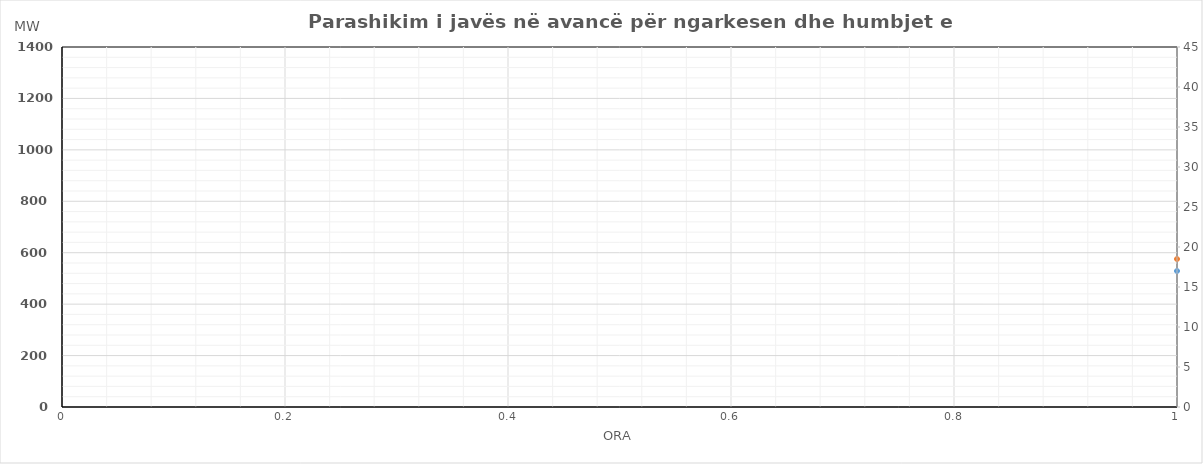
| Category | Ngarkesa (MWh) |
|---|---|
| 0 | 575.49 |
| 1 | 514.28 |
| 2 | 489.96 |
| 3 | 501.05 |
| 4 | 510.86 |
| 5 | 537.47 |
| 6 | 725.06 |
| 7 | 910.97 |
| 8 | 968.1 |
| 9 | 945.86 |
| 10 | 905.07 |
| 11 | 815.96 |
| 12 | 793.82 |
| 13 | 798.13 |
| 14 | 799.44 |
| 15 | 781.47 |
| 16 | 782.1 |
| 17 | 890.79 |
| 18 | 1000.01 |
| 19 | 1187.23 |
| 20 | 1229.87 |
| 21 | 1147.37 |
| 22 | 910.8 |
| 23 | 785.62 |
| 24 | 641.33 |
| 25 | 519.63 |
| 26 | 485.42 |
| 27 | 506.08 |
| 28 | 581.92 |
| 29 | 595.91 |
| 30 | 715.11 |
| 31 | 897.44 |
| 32 | 954.7 |
| 33 | 927.01 |
| 34 | 825.48 |
| 35 | 804.83 |
| 36 | 752.1 |
| 37 | 771.41 |
| 38 | 795.86 |
| 39 | 800.37 |
| 40 | 762.36 |
| 41 | 786.5 |
| 42 | 902.39 |
| 43 | 1001.83 |
| 44 | 1025.08 |
| 45 | 966.7 |
| 46 | 787.59 |
| 47 | 659.82 |
| 48 | 669.32 |
| 49 | 581.34 |
| 50 | 538.36 |
| 51 | 548.74 |
| 52 | 563.36 |
| 53 | 586.68 |
| 54 | 705.22 |
| 55 | 926.44 |
| 56 | 986.55 |
| 57 | 960.91 |
| 58 | 910.22 |
| 59 | 888.85 |
| 60 | 867.94 |
| 61 | 866.33 |
| 62 | 861.95 |
| 63 | 850.65 |
| 64 | 857.26 |
| 65 | 905.07 |
| 66 | 960.34 |
| 67 | 1067.69 |
| 68 | 1121.42 |
| 69 | 1062.9 |
| 70 | 931.52 |
| 71 | 756.63 |
| 72 | 608.39 |
| 73 | 547.09 |
| 74 | 534.79 |
| 75 | 537.47 |
| 76 | 546.78 |
| 77 | 567.87 |
| 78 | 698.35 |
| 79 | 890.58 |
| 80 | 945.14 |
| 81 | 920.43 |
| 82 | 867.71 |
| 83 | 842.98 |
| 84 | 822.08 |
| 85 | 830.26 |
| 86 | 839.15 |
| 87 | 822.43 |
| 88 | 821.12 |
| 89 | 881.5 |
| 90 | 938.84 |
| 91 | 1019.07 |
| 92 | 1064.2 |
| 93 | 993.29 |
| 94 | 864.59 |
| 95 | 727.89 |
| 96 | 588.61 |
| 97 | 530.3 |
| 98 | 507.68 |
| 99 | 502.97 |
| 100 | 511.28 |
| 101 | 549.69 |
| 102 | 621.58 |
| 103 | 751.69 |
| 104 | 867.02 |
| 105 | 958.98 |
| 106 | 1006.89 |
| 107 | 1004.58 |
| 108 | 903.84 |
| 109 | 840.85 |
| 110 | 803.56 |
| 111 | 814.79 |
| 112 | 820.92 |
| 113 | 854.61 |
| 114 | 819.43 |
| 115 | 887.45 |
| 116 | 921.19 |
| 117 | 851.09 |
| 118 | 729.92 |
| 119 | 590.54 |
| 120 | 594.31 |
| 121 | 532.4 |
| 122 | 504.28 |
| 123 | 515.47 |
| 124 | 536.98 |
| 125 | 547.59 |
| 126 | 642.88 |
| 127 | 790.89 |
| 128 | 902.42 |
| 129 | 920.78 |
| 130 | 898.79 |
| 131 | 872.78 |
| 132 | 850.64 |
| 133 | 780.55 |
| 134 | 765.46 |
| 135 | 736.29 |
| 136 | 762.62 |
| 137 | 778.91 |
| 138 | 875.53 |
| 139 | 964.55 |
| 140 | 1007.99 |
| 141 | 940.79 |
| 142 | 825.72 |
| 143 | 709.54 |
| 144 | 647.59 |
| 145 | 562.08 |
| 146 | 516.76 |
| 147 | 508.85 |
| 148 | 527.36 |
| 149 | 524.57 |
| 150 | 579.36 |
| 151 | 693.47 |
| 152 | 811.3 |
| 153 | 877.46 |
| 154 | 888.77 |
| 155 | 778.06 |
| 156 | 782.02 |
| 157 | 778.03 |
| 158 | 747.94 |
| 159 | 678.57 |
| 160 | 692.7 |
| 161 | 736.89 |
| 162 | 865.11 |
| 163 | 947.13 |
| 164 | 958.47 |
| 165 | 886.67 |
| 166 | 806.6 |
| 167 | 658.22 |